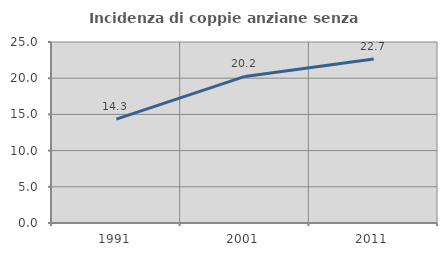
| Category | Incidenza di coppie anziane senza figli  |
|---|---|
| 1991.0 | 14.338 |
| 2001.0 | 20.243 |
| 2011.0 | 22.66 |